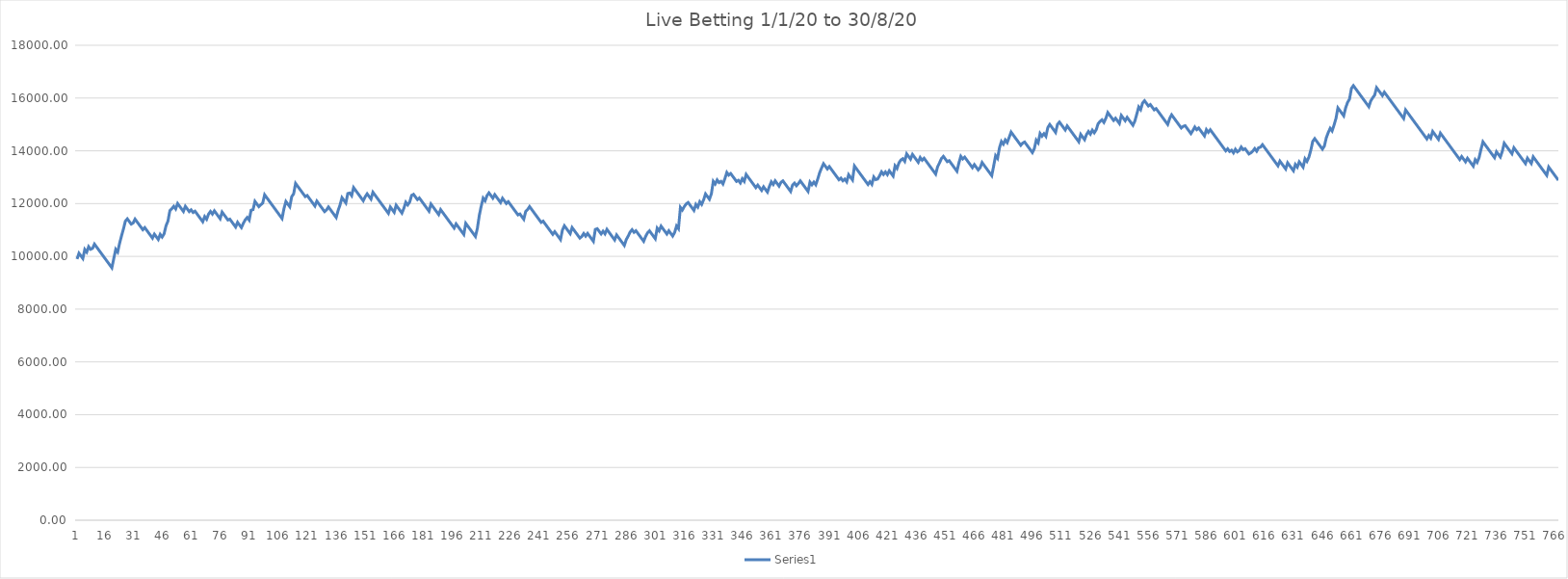
| Category | Series 0 |
|---|---|
| 0 | 9900 |
| 1 | 10118.54 |
| 2 | 10018.54 |
| 3 | 9918.54 |
| 4 | 10261.54 |
| 5 | 10161.54 |
| 6 | 10367.34 |
| 7 | 10267.34 |
| 8 | 10302.62 |
| 9 | 10466.28 |
| 10 | 10366.28 |
| 11 | 10266.28 |
| 12 | 10166.28 |
| 13 | 10066.28 |
| 14 | 9966.28 |
| 15 | 9866.28 |
| 16 | 9766.28 |
| 17 | 9666.28 |
| 18 | 9566.28 |
| 19 | 9919.08 |
| 20 | 10264.04 |
| 21 | 10164.04 |
| 22 | 10497.24 |
| 23 | 10776.54 |
| 24 | 11042.12 |
| 25 | 11337.1 |
| 26 | 11422.36 |
| 27 | 11322.36 |
| 28 | 11222.36 |
| 29 | 11265.48 |
| 30 | 11410.52 |
| 31 | 11310.52 |
| 32 | 11210.52 |
| 33 | 11110.52 |
| 34 | 11010.52 |
| 35 | 11091.86 |
| 36 | 10991.86 |
| 37 | 10891.86 |
| 38 | 10791.86 |
| 39 | 10691.86 |
| 40 | 10840.82 |
| 41 | 10740.82 |
| 42 | 10640.82 |
| 43 | 10833.88 |
| 44 | 10733.88 |
| 45 | 10851.48 |
| 46 | 11158.22 |
| 47 | 11336.58 |
| 48 | 11731.52 |
| 49 | 11806 |
| 50 | 11897.14 |
| 51 | 11797.14 |
| 52 | 12002.94 |
| 53 | 11902.94 |
| 54 | 11802.94 |
| 55 | 11702.94 |
| 56 | 11896.98 |
| 57 | 11796.98 |
| 58 | 11696.98 |
| 59 | 11762.64 |
| 60 | 11662.64 |
| 61 | 11712.62 |
| 62 | 11612.62 |
| 63 | 11512.62 |
| 64 | 11412.62 |
| 65 | 11312.62 |
| 66 | 11507.64 |
| 67 | 11407.64 |
| 68 | 11600.7 |
| 69 | 11702.62 |
| 70 | 11602.62 |
| 71 | 11726.1 |
| 72 | 11626.1 |
| 73 | 11526.1 |
| 74 | 11426.1 |
| 75 | 11678.94 |
| 76 | 11578.94 |
| 77 | 11478.94 |
| 78 | 11378.94 |
| 79 | 11411.28 |
| 80 | 11311.28 |
| 81 | 11211.28 |
| 82 | 11111.28 |
| 83 | 11291.6 |
| 84 | 11191.6 |
| 85 | 11091.6 |
| 86 | 11254.28 |
| 87 | 11387.56 |
| 88 | 11475.76 |
| 89 | 11375.76 |
| 90 | 11748.16 |
| 91 | 11770.7 |
| 92 | 12084.3 |
| 93 | 11984.3 |
| 94 | 11884.3 |
| 95 | 11955.84 |
| 96 | 12016.6 |
| 97 | 12334.12 |
| 98 | 12234.12 |
| 99 | 12134.12 |
| 100 | 12034.12 |
| 101 | 11934.12 |
| 102 | 11834.12 |
| 103 | 11734.12 |
| 104 | 11634.12 |
| 105 | 11534.12 |
| 106 | 11434.12 |
| 107 | 11811.42 |
| 108 | 12079.94 |
| 109 | 11979.94 |
| 110 | 11879.94 |
| 111 | 12263.12 |
| 112 | 12368.96 |
| 113 | 12765.86 |
| 114 | 12665.86 |
| 115 | 12565.86 |
| 116 | 12465.86 |
| 117 | 12365.86 |
| 118 | 12265.86 |
| 119 | 12308 |
| 120 | 12208 |
| 121 | 12108 |
| 122 | 12008 |
| 123 | 11908 |
| 124 | 12095.18 |
| 125 | 11995.18 |
| 126 | 11895.18 |
| 127 | 11795.18 |
| 128 | 11695.18 |
| 129 | 11759.86 |
| 130 | 11873.54 |
| 131 | 11773.54 |
| 132 | 11673.54 |
| 133 | 11573.54 |
| 134 | 11473.54 |
| 135 | 11738.14 |
| 136 | 11951.78 |
| 137 | 12225.2 |
| 138 | 12125.2 |
| 139 | 12025.2 |
| 140 | 12381.92 |
| 141 | 12401.52 |
| 142 | 12301.52 |
| 143 | 12607.28 |
| 144 | 12507.28 |
| 145 | 12407.28 |
| 146 | 12307.28 |
| 147 | 12207.28 |
| 148 | 12107.28 |
| 149 | 12260.16 |
| 150 | 12371.88 |
| 151 | 12271.88 |
| 152 | 12171.88 |
| 153 | 12430.6 |
| 154 | 12330.6 |
| 155 | 12230.6 |
| 156 | 12130.6 |
| 157 | 12030.6 |
| 158 | 11930.6 |
| 159 | 11830.6 |
| 160 | 11730.6 |
| 161 | 11630.6 |
| 162 | 11870.7 |
| 163 | 11770.7 |
| 164 | 11670.7 |
| 165 | 11939.22 |
| 166 | 11839.22 |
| 167 | 11739.22 |
| 168 | 11639.22 |
| 169 | 11821.5 |
| 170 | 12051.8 |
| 171 | 11951.8 |
| 172 | 12055.68 |
| 173 | 12311.46 |
| 174 | 12351.64 |
| 175 | 12251.64 |
| 176 | 12151.64 |
| 177 | 12213.38 |
| 178 | 12113.38 |
| 179 | 12013.38 |
| 180 | 11913.38 |
| 181 | 11813.38 |
| 182 | 11713.38 |
| 183 | 11984.84 |
| 184 | 11884.84 |
| 185 | 11784.84 |
| 186 | 11684.84 |
| 187 | 11584.84 |
| 188 | 11772.02 |
| 189 | 11672.02 |
| 190 | 11572.02 |
| 191 | 11472.02 |
| 192 | 11372.02 |
| 193 | 11272.02 |
| 194 | 11172.02 |
| 195 | 11072.02 |
| 196 | 11230.78 |
| 197 | 11130.78 |
| 198 | 11030.78 |
| 199 | 10930.78 |
| 200 | 10830.78 |
| 201 | 11253.16 |
| 202 | 11153.16 |
| 203 | 11053.16 |
| 204 | 10953.16 |
| 205 | 10853.16 |
| 206 | 10753.16 |
| 207 | 11058.92 |
| 208 | 11549.9 |
| 209 | 11902.7 |
| 210 | 12206.5 |
| 211 | 12106.5 |
| 212 | 12302.5 |
| 213 | 12406.38 |
| 214 | 12306.38 |
| 215 | 12206.38 |
| 216 | 12340.64 |
| 217 | 12240.64 |
| 218 | 12140.64 |
| 219 | 12040.64 |
| 220 | 12201.36 |
| 221 | 12101.36 |
| 222 | 12001.36 |
| 223 | 12071.92 |
| 224 | 11971.92 |
| 225 | 11871.92 |
| 226 | 11771.92 |
| 227 | 11671.92 |
| 228 | 11571.92 |
| 229 | 11607.2 |
| 230 | 11507.2 |
| 231 | 11407.2 |
| 232 | 11701.2 |
| 233 | 11773.72 |
| 234 | 11887.4 |
| 235 | 11787.4 |
| 236 | 11687.4 |
| 237 | 11587.4 |
| 238 | 11487.4 |
| 239 | 11387.4 |
| 240 | 11287.4 |
| 241 | 11335.42 |
| 242 | 11235.42 |
| 243 | 11135.42 |
| 244 | 11035.42 |
| 245 | 10935.42 |
| 246 | 10835.42 |
| 247 | 10937.34 |
| 248 | 10837.34 |
| 249 | 10737.34 |
| 250 | 10637.34 |
| 251 | 10999.94 |
| 252 | 11159.68 |
| 253 | 11059.68 |
| 254 | 10959.68 |
| 255 | 10859.68 |
| 256 | 11091.94 |
| 257 | 10991.94 |
| 258 | 10891.94 |
| 259 | 10791.94 |
| 260 | 10691.94 |
| 261 | 10752.7 |
| 262 | 10866.38 |
| 263 | 10766.38 |
| 264 | 10870.26 |
| 265 | 10770.26 |
| 266 | 10670.26 |
| 267 | 10570.26 |
| 268 | 11021.06 |
| 269 | 11049.48 |
| 270 | 10949.48 |
| 271 | 10849.48 |
| 272 | 10953.36 |
| 273 | 10853.36 |
| 274 | 11022.9 |
| 275 | 10922.9 |
| 276 | 10822.9 |
| 277 | 10722.9 |
| 278 | 10622.9 |
| 279 | 10813.02 |
| 280 | 10713.02 |
| 281 | 10613.02 |
| 282 | 10513.02 |
| 283 | 10413.02 |
| 284 | 10637.44 |
| 285 | 10767.78 |
| 286 | 10920.66 |
| 287 | 11010.82 |
| 288 | 10910.82 |
| 289 | 10971.58 |
| 290 | 10871.58 |
| 291 | 10771.58 |
| 292 | 10671.58 |
| 293 | 10571.58 |
| 294 | 10752.88 |
| 295 | 10892.04 |
| 296 | 10968.48 |
| 297 | 10868.48 |
| 298 | 10768.48 |
| 299 | 10668.48 |
| 300 | 11067.34 |
| 301 | 10967.34 |
| 302 | 11146.68 |
| 303 | 11046.68 |
| 304 | 10946.68 |
| 305 | 10846.68 |
| 306 | 10970.16 |
| 307 | 10870.16 |
| 308 | 10770.16 |
| 309 | 10902.46 |
| 310 | 11150.4 |
| 311 | 11050.4 |
| 312 | 11856.94 |
| 313 | 11756.94 |
| 314 | 11886.3 |
| 315 | 11988.22 |
| 316 | 12041.14 |
| 317 | 11941.14 |
| 318 | 11841.14 |
| 319 | 11741.14 |
| 320 | 11969.48 |
| 321 | 11869.48 |
| 322 | 12070.38 |
| 323 | 11970.38 |
| 324 | 12142.86 |
| 325 | 12365.32 |
| 326 | 12265.32 |
| 327 | 12165.32 |
| 328 | 12367.2 |
| 329 | 12843.48 |
| 330 | 12743.48 |
| 331 | 12896.36 |
| 332 | 12796.36 |
| 333 | 12842.42 |
| 334 | 12742.42 |
| 335 | 12945.28 |
| 336 | 13180.48 |
| 337 | 13080.48 |
| 338 | 13140.26 |
| 339 | 13040.26 |
| 340 | 12940.26 |
| 341 | 12840.26 |
| 342 | 12883.38 |
| 343 | 12783.38 |
| 344 | 12942.14 |
| 345 | 12842.14 |
| 346 | 13104.78 |
| 347 | 13004.78 |
| 348 | 12904.78 |
| 349 | 12804.78 |
| 350 | 12704.78 |
| 351 | 12604.78 |
| 352 | 12700.82 |
| 353 | 12600.82 |
| 354 | 12500.82 |
| 355 | 12636.06 |
| 356 | 12536.06 |
| 357 | 12436.06 |
| 358 | 12646.76 |
| 359 | 12825.12 |
| 360 | 12725.12 |
| 361 | 12863.3 |
| 362 | 12763.3 |
| 363 | 12663.3 |
| 364 | 12805.4 |
| 365 | 12861.26 |
| 366 | 12761.26 |
| 367 | 12661.26 |
| 368 | 12561.26 |
| 369 | 12461.26 |
| 370 | 12701.36 |
| 371 | 12777.8 |
| 372 | 12677.8 |
| 373 | 12758.16 |
| 374 | 12862.04 |
| 375 | 12762.04 |
| 376 | 12662.04 |
| 377 | 12562.04 |
| 378 | 12462.04 |
| 379 | 12812.88 |
| 380 | 12712.88 |
| 381 | 12814.8 |
| 382 | 12714.8 |
| 383 | 12925.5 |
| 384 | 13170.5 |
| 385 | 13349.84 |
| 386 | 13512.52 |
| 387 | 13412.52 |
| 388 | 13312.52 |
| 389 | 13403.66 |
| 390 | 13303.66 |
| 391 | 13203.66 |
| 392 | 13103.66 |
| 393 | 13003.66 |
| 394 | 12903.66 |
| 395 | 12964.42 |
| 396 | 12864.42 |
| 397 | 12927.14 |
| 398 | 12827.14 |
| 399 | 13095.66 |
| 400 | 12995.66 |
| 401 | 12895.66 |
| 402 | 13424.86 |
| 403 | 13324.86 |
| 404 | 13224.86 |
| 405 | 13124.86 |
| 406 | 13024.86 |
| 407 | 12924.86 |
| 408 | 12824.86 |
| 409 | 12724.86 |
| 410 | 12829.72 |
| 411 | 12729.72 |
| 412 | 13008.04 |
| 413 | 12908.04 |
| 414 | 12930.58 |
| 415 | 13053.08 |
| 416 | 13204 |
| 417 | 13104 |
| 418 | 13199.06 |
| 419 | 13099.06 |
| 420 | 13245.08 |
| 421 | 13145.08 |
| 422 | 13045.08 |
| 423 | 13431.2 |
| 424 | 13331.2 |
| 425 | 13541.9 |
| 426 | 13650.68 |
| 427 | 13701.64 |
| 428 | 13601.64 |
| 429 | 13885.84 |
| 430 | 13785.84 |
| 431 | 13685.84 |
| 432 | 13864.24 |
| 433 | 13764.24 |
| 434 | 13664.24 |
| 435 | 13564.24 |
| 436 | 13745.54 |
| 437 | 13645.54 |
| 438 | 13718.06 |
| 439 | 13618.06 |
| 440 | 13518.06 |
| 441 | 13418.06 |
| 442 | 13318.06 |
| 443 | 13218.06 |
| 444 | 13118.06 |
| 445 | 13397.36 |
| 446 | 13544.36 |
| 447 | 13711.94 |
| 448 | 13788.38 |
| 449 | 13688.38 |
| 450 | 13588.38 |
| 451 | 13626.6 |
| 452 | 13526.6 |
| 453 | 13426.6 |
| 454 | 13326.6 |
| 455 | 13226.6 |
| 456 | 13540.2 |
| 457 | 13792.06 |
| 458 | 13692.06 |
| 459 | 13761.64 |
| 460 | 13661.64 |
| 461 | 13561.64 |
| 462 | 13461.64 |
| 463 | 13361.64 |
| 464 | 13477.28 |
| 465 | 13377.28 |
| 466 | 13277.28 |
| 467 | 13361.56 |
| 468 | 13557.56 |
| 469 | 13457.56 |
| 470 | 13357.56 |
| 471 | 13257.56 |
| 472 | 13157.56 |
| 473 | 13057.56 |
| 474 | 13431.92 |
| 475 | 13816.12 |
| 476 | 13716.12 |
| 477 | 14117.92 |
| 478 | 14353.16 |
| 479 | 14253.16 |
| 480 | 14412.9 |
| 481 | 14312.9 |
| 482 | 14508.9 |
| 483 | 14709.8 |
| 484 | 14609.8 |
| 485 | 14509.8 |
| 486 | 14409.8 |
| 487 | 14309.8 |
| 488 | 14209.8 |
| 489 | 14294.08 |
| 490 | 14334.26 |
| 491 | 14234.26 |
| 492 | 14134.26 |
| 493 | 14034.26 |
| 494 | 13934.26 |
| 495 | 14079.3 |
| 496 | 14403.68 |
| 497 | 14303.68 |
| 498 | 14656.48 |
| 499 | 14556.48 |
| 500 | 14649.58 |
| 501 | 14549.58 |
| 502 | 14882.78 |
| 503 | 14998.42 |
| 504 | 14898.42 |
| 505 | 14798.42 |
| 506 | 14698.42 |
| 507 | 15002.22 |
| 508 | 15089.44 |
| 509 | 14989.44 |
| 510 | 14889.44 |
| 511 | 14789.44 |
| 512 | 14944.28 |
| 513 | 14844.28 |
| 514 | 14744.28 |
| 515 | 14644.28 |
| 516 | 14544.28 |
| 517 | 14444.28 |
| 518 | 14344.28 |
| 519 | 14623.58 |
| 520 | 14523.58 |
| 521 | 14423.58 |
| 522 | 14618.6 |
| 523 | 14732.28 |
| 524 | 14632.28 |
| 525 | 14783.2 |
| 526 | 14683.2 |
| 527 | 14794.92 |
| 528 | 15026.2 |
| 529 | 15114.4 |
| 530 | 15176.14 |
| 531 | 15076.14 |
| 532 | 15231.96 |
| 533 | 15451.48 |
| 534 | 15351.48 |
| 535 | 15251.48 |
| 536 | 15151.48 |
| 537 | 15236.74 |
| 538 | 15136.74 |
| 539 | 15036.74 |
| 540 | 15340.54 |
| 541 | 15240.54 |
| 542 | 15140.54 |
| 543 | 15267.94 |
| 544 | 15167.94 |
| 545 | 15067.94 |
| 546 | 14967.94 |
| 547 | 15127.68 |
| 548 | 15390.32 |
| 549 | 15662.76 |
| 550 | 15562.76 |
| 551 | 15812.66 |
| 552 | 15898.9 |
| 553 | 15798.9 |
| 554 | 15698.9 |
| 555 | 15752.8 |
| 556 | 15652.8 |
| 557 | 15552.8 |
| 558 | 15598.86 |
| 559 | 15498.86 |
| 560 | 15398.86 |
| 561 | 15298.86 |
| 562 | 15198.86 |
| 563 | 15098.86 |
| 564 | 14998.86 |
| 565 | 15222.3 |
| 566 | 15365.38 |
| 567 | 15265.38 |
| 568 | 15165.38 |
| 569 | 15065.38 |
| 570 | 14965.38 |
| 571 | 14865.38 |
| 572 | 14927.12 |
| 573 | 14953.58 |
| 574 | 14853.58 |
| 575 | 14753.58 |
| 576 | 14653.58 |
| 577 | 14771.18 |
| 578 | 14901.52 |
| 579 | 14801.52 |
| 580 | 14866.2 |
| 581 | 14766.2 |
| 582 | 14666.2 |
| 583 | 14566.2 |
| 584 | 14802.38 |
| 585 | 14702.38 |
| 586 | 14798.42 |
| 587 | 14698.42 |
| 588 | 14598.42 |
| 589 | 14498.42 |
| 590 | 14398.42 |
| 591 | 14298.42 |
| 592 | 14198.42 |
| 593 | 14098.42 |
| 594 | 13998.42 |
| 595 | 14075.84 |
| 596 | 13975.84 |
| 597 | 14022.88 |
| 598 | 13922.88 |
| 599 | 14060.08 |
| 600 | 13960.08 |
| 601 | 14012.02 |
| 602 | 14143.34 |
| 603 | 14043.34 |
| 604 | 14080.58 |
| 605 | 13980.58 |
| 606 | 13880.58 |
| 607 | 13923.7 |
| 608 | 13989.36 |
| 609 | 14086.38 |
| 610 | 13986.38 |
| 611 | 14116.72 |
| 612 | 14141.22 |
| 613 | 14232.36 |
| 614 | 14132.36 |
| 615 | 14032.36 |
| 616 | 13932.36 |
| 617 | 13832.36 |
| 618 | 13732.36 |
| 619 | 13632.36 |
| 620 | 13532.36 |
| 621 | 13432.36 |
| 622 | 13610.72 |
| 623 | 13510.72 |
| 624 | 13410.72 |
| 625 | 13310.72 |
| 626 | 13544.94 |
| 627 | 13444.94 |
| 628 | 13344.94 |
| 629 | 13244.94 |
| 630 | 13482.1 |
| 631 | 13382.1 |
| 632 | 13581.04 |
| 633 | 13481.04 |
| 634 | 13381.04 |
| 635 | 13698.56 |
| 636 | 13598.56 |
| 637 | 13759.28 |
| 638 | 14027.8 |
| 639 | 14359.04 |
| 640 | 14462.92 |
| 641 | 14362.92 |
| 642 | 14262.92 |
| 643 | 14162.92 |
| 644 | 14062.92 |
| 645 | 14182.48 |
| 646 | 14496.08 |
| 647 | 14692.08 |
| 648 | 14852.8 |
| 649 | 14752.8 |
| 650 | 14975.26 |
| 651 | 15227.12 |
| 652 | 15626.96 |
| 653 | 15526.96 |
| 654 | 15426.96 |
| 655 | 15326.96 |
| 656 | 15628.8 |
| 657 | 15834.6 |
| 658 | 15960.04 |
| 659 | 16366.74 |
| 660 | 16470.62 |
| 661 | 16370.62 |
| 662 | 16270.62 |
| 663 | 16170.62 |
| 664 | 16070.62 |
| 665 | 15970.62 |
| 666 | 15870.62 |
| 667 | 15770.62 |
| 668 | 15670.62 |
| 669 | 15892.1 |
| 670 | 16011.66 |
| 671 | 16111.62 |
| 672 | 16392.88 |
| 673 | 16292.88 |
| 674 | 16192.88 |
| 675 | 16092.88 |
| 676 | 16224.2 |
| 677 | 16124.2 |
| 678 | 16024.2 |
| 679 | 15924.2 |
| 680 | 15824.2 |
| 681 | 15724.2 |
| 682 | 15624.2 |
| 683 | 15524.2 |
| 684 | 15424.2 |
| 685 | 15324.2 |
| 686 | 15224.2 |
| 687 | 15550.54 |
| 688 | 15450.54 |
| 689 | 15350.54 |
| 690 | 15250.54 |
| 691 | 15150.54 |
| 692 | 15050.54 |
| 693 | 14950.54 |
| 694 | 14850.54 |
| 695 | 14750.54 |
| 696 | 14650.54 |
| 697 | 14550.54 |
| 698 | 14450.54 |
| 699 | 14581.86 |
| 700 | 14481.86 |
| 701 | 14733.72 |
| 702 | 14633.72 |
| 703 | 14533.72 |
| 704 | 14433.72 |
| 705 | 14669.9 |
| 706 | 14569.9 |
| 707 | 14469.9 |
| 708 | 14369.9 |
| 709 | 14269.9 |
| 710 | 14169.9 |
| 711 | 14069.9 |
| 712 | 13969.9 |
| 713 | 13869.9 |
| 714 | 13769.9 |
| 715 | 13669.9 |
| 716 | 13783.58 |
| 717 | 13683.58 |
| 718 | 13583.58 |
| 719 | 13718.82 |
| 720 | 13618.82 |
| 721 | 13518.82 |
| 722 | 13418.82 |
| 723 | 13661.86 |
| 724 | 13561.86 |
| 725 | 13741.2 |
| 726 | 14056.72 |
| 727 | 14340.92 |
| 728 | 14240.92 |
| 729 | 14140.92 |
| 730 | 14040.92 |
| 731 | 13940.92 |
| 732 | 13840.92 |
| 733 | 13740.92 |
| 734 | 13965.34 |
| 735 | 13865.34 |
| 736 | 13765.34 |
| 737 | 13977.02 |
| 738 | 14288.66 |
| 739 | 14188.66 |
| 740 | 14088.66 |
| 741 | 13988.66 |
| 742 | 13888.66 |
| 743 | 14117 |
| 744 | 14017 |
| 745 | 13917 |
| 746 | 13817 |
| 747 | 13717 |
| 748 | 13617 |
| 749 | 13517 |
| 750 | 13721.82 |
| 751 | 13621.82 |
| 752 | 13521.82 |
| 753 | 13771.72 |
| 754 | 13671.72 |
| 755 | 13571.72 |
| 756 | 13471.72 |
| 757 | 13371.72 |
| 758 | 13271.72 |
| 759 | 13171.72 |
| 760 | 13071.72 |
| 761 | 13385.32 |
| 762 | 13285.32 |
| 763 | 13185.32 |
| 764 | 13085.32 |
| 765 | 12985.32 |
| 766 | 12885.32 |